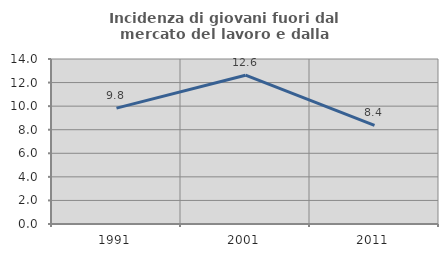
| Category | Incidenza di giovani fuori dal mercato del lavoro e dalla formazione  |
|---|---|
| 1991.0 | 9.835 |
| 2001.0 | 12.627 |
| 2011.0 | 8.364 |